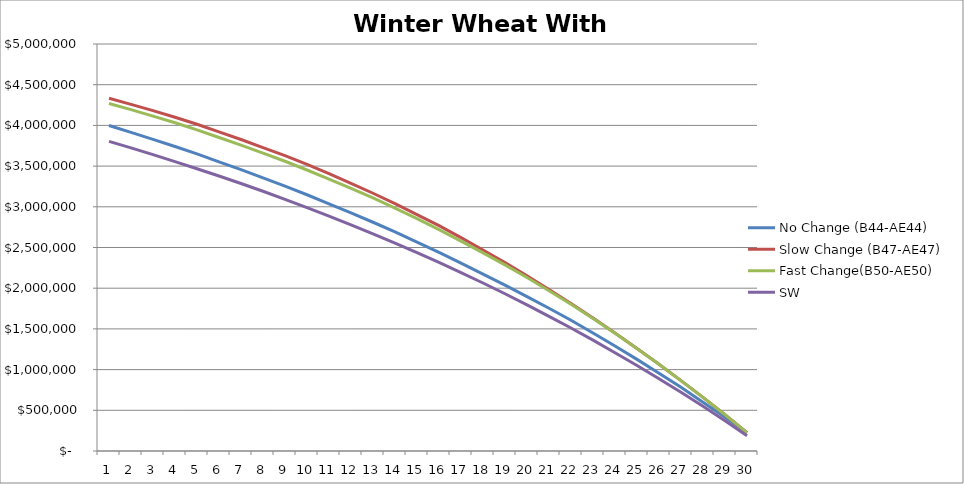
| Category | No Change (B44-AE44) | Slow Change (B47-AE47) | Fast Change(B50-AE50) | SW |
|---|---|---|---|---|
| 0 | 3998922.792 | 4332913.034 | 4269828.054 | 3804208.32 |
| 1 | 3914811.499 | 4258821.448 | 4193843.919 | 3723158.718 |
| 2 | 3827727.881 | 4181141.887 | 4114366.387 | 3640749.233 |
| 3 | 3740938.055 | 4100007.228 | 4032078.348 | 3555227.111 |
| 4 | 3649844.625 | 4013790.455 | 3945294.65 | 3467549.952 |
| 5 | 3551832.775 | 3920358.51 | 3851586.193 | 3378698.819 |
| 6 | 3455973.006 | 3826908.161 | 3758555.513 | 3285903.824 |
| 7 | 3354629.422 | 3728043.702 | 3659700.099 | 3191064.651 |
| 8 | 3253657.801 | 3627582.982 | 3559324.935 | 3091829.608 |
| 9 | 3147904.035 | 3520296.559 | 3452308.279 | 2990363.114 |
| 10 | 3036757.653 | 3406240.994 | 3340941.011 | 2885867.957 |
| 11 | 2925092.931 | 3289088.661 | 3226868.313 | 2778825.952 |
| 12 | 2810231.283 | 3166447.949 | 3108841.823 | 2667911.803 |
| 13 | 2690469.978 | 3038303.399 | 2984394.647 | 2554277.991 |
| 14 | 2566464.602 | 2904673.471 | 2853654.58 | 2437940.193 |
| 15 | 2439199.108 | 2767796.763 | 2719464.102 | 2317084.461 |
| 16 | 2307109.527 | 2621525.347 | 2578798.616 | 2191711.663 |
| 17 | 2173648.577 | 2470002.72 | 2433984.578 | 2063791.084 |
| 18 | 2037281.247 | 2315077.394 | 2286762.017 | 1931621.096 |
| 19 | 1895837.11 | 2152658.531 | 2130563.903 | 1795027.57 |
| 20 | 1753728.295 | 1984343.471 | 1968980.83 | 1654413.296 |
| 21 | 1607047.719 | 1811847.148 | 1801819.983 | 1511102.661 |
| 22 | 1449153.433 | 1632812.902 | 1626593.157 | 1361462.167 |
| 23 | 1289709.347 | 1449319.733 | 1445827.368 | 1207046.265 |
| 24 | 1125301.075 | 1258530.28 | 1257823.68 | 1049398.607 |
| 25 | 955565.642 | 1064788.033 | 1064788.033 | 887722.216 |
| 26 | 783348.087 | 864824.739 | 864824.739 | 722250.983 |
| 27 | 599720.626 | 658508.522 | 658508.522 | 550287.134 |
| 28 | 415365.856 | 445349.982 | 445349.982 | 371883.517 |
| 29 | 225974.631 | 225974.631 | 225974.631 | 188596.541 |